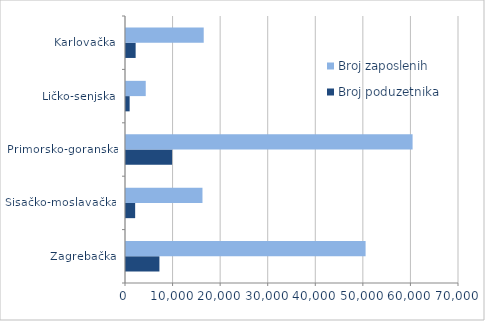
| Category | Broj poduzetnika | Broj zaposlenih |
|---|---|---|
| Zagrebačka | 7026 | 50365 |
| Sisačko-moslavačka | 1925 | 16076 |
| Primorsko-goranska | 9689 | 60244 |
| Ličko-senjska | 765 | 4150 |
| Karlovačka | 2027 | 16337 |